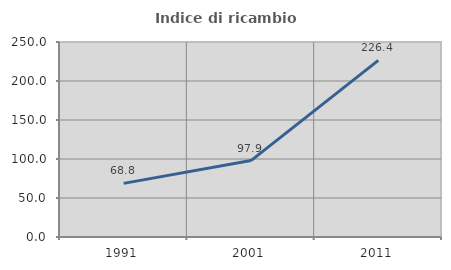
| Category | Indice di ricambio occupazionale  |
|---|---|
| 1991.0 | 68.761 |
| 2001.0 | 97.949 |
| 2011.0 | 226.439 |